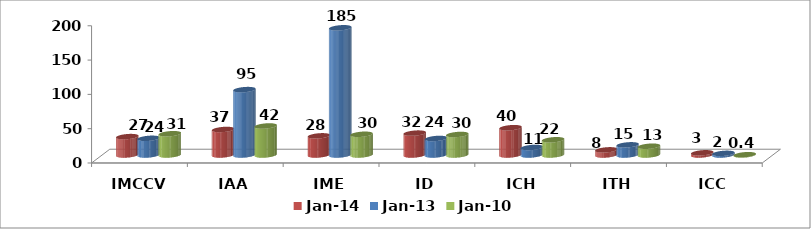
| Category | janv-14 | janv-13 | janv-10 |
|---|---|---|---|
| IMCCV | 26.8 | 24.3 | 31 |
| IAA | 37.2 | 95.3 | 42.3 |
| IME | 27.9 | 185.4 | 30.2 |
| ID | 31.9 | 24.1 | 29.9 |
| ICH | 39.8 | 11 | 22.2 |
| ITH | 7.5 | 14.8 | 12.8 |
| ICC | 3.2 | 2.4 | 0.4 |